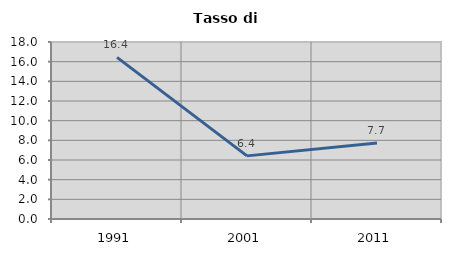
| Category | Tasso di disoccupazione   |
|---|---|
| 1991.0 | 16.438 |
| 2001.0 | 6.419 |
| 2011.0 | 7.722 |